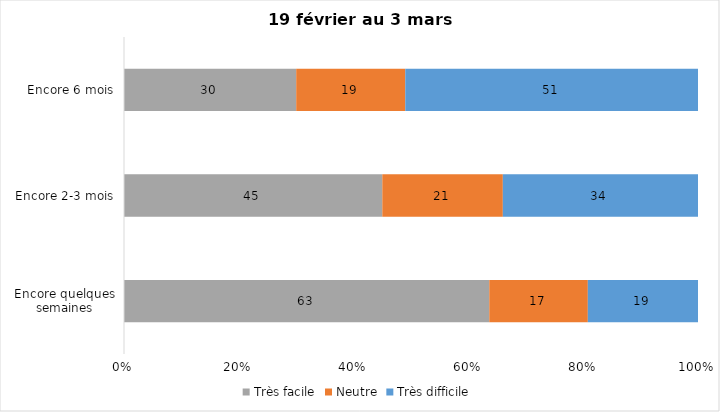
| Category | Très facile | Neutre | Très difficile |
|---|---|---|---|
| Encore quelques semaines | 63 | 17 | 19 |
| Encore 2-3 mois | 45 | 21 | 34 |
| Encore 6 mois | 30 | 19 | 51 |